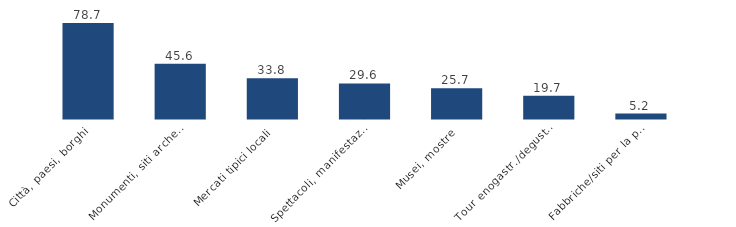
| Category | Totale Viaggi |
|---|---|
| Città, paesi, borghi | 78.7 |
| Monumenti, siti archeologici | 45.6 |
| Mercati tipici locali | 33.8 |
| Spettacoli, manifestazioni | 29.6 |
| Musei, mostre | 25.7 |
| Tour enogastr./degustazioni | 19.7 |
| Fabbriche/siti per la produzione di beni  | 5.2 |